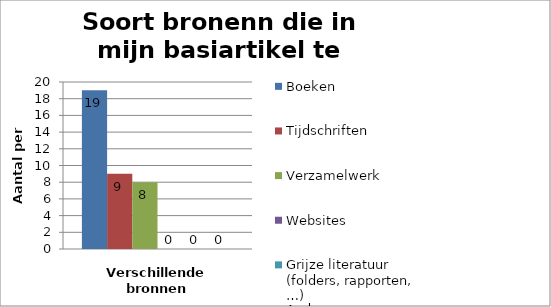
| Category | Boeken | Tijdschriften | Verzamelwerk | Websites | Grijze literatuur (folders, rapporten, …) | Andere |
|---|---|---|---|---|---|---|
| Aantal | 19 | 9 | 8 | 0 | 0 | 0 |